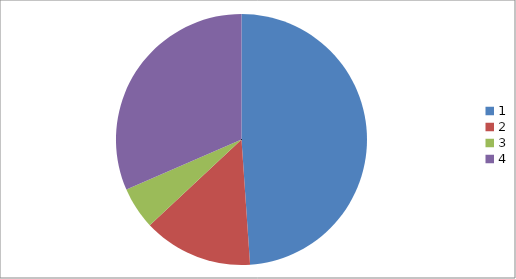
| Category | Series 0 |
|---|---|
| 0 | 45 |
| 1 | 13 |
| 2 | 5 |
| 3 | 29 |